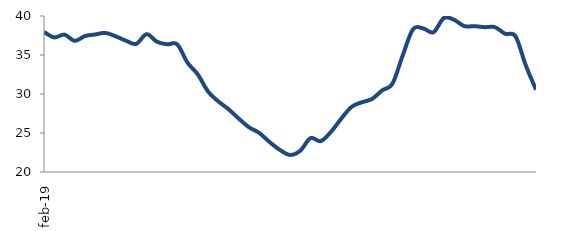
| Category | Series 0 |
|---|---|
| 2019-02-01 | 37.949 |
| 2019-03-01 | 37.255 |
| 2019-04-01 | 37.61 |
| 2019-05-01 | 36.815 |
| 2019-06-01 | 37.435 |
| 2019-07-01 | 37.632 |
| 2019-08-01 | 37.831 |
| 2019-09-01 | 37.39 |
| 2019-10-01 | 36.831 |
| 2019-11-01 | 36.425 |
| 2019-12-01 | 37.671 |
| 2020-01-01 | 36.714 |
| 2020-02-01 | 36.369 |
| 2020-03-01 | 36.361 |
| 2020-04-01 | 34.017 |
| 2020-05-01 | 32.52 |
| 2020-06-01 | 30.328 |
| 2020-07-01 | 29.058 |
| 2020-08-01 | 28.052 |
| 2020-09-01 | 26.848 |
| 2020-10-01 | 25.737 |
| 2020-11-01 | 25.008 |
| 2020-12-01 | 23.848 |
| 2021-01-01 | 22.846 |
| 2021-02-01 | 22.188 |
| 2021-03-01 | 22.726 |
| 2021-04-01 | 24.345 |
| 2021-05-01 | 23.958 |
| 2021-06-01 | 25.156 |
| 2021-07-01 | 26.838 |
| 2021-08-01 | 28.346 |
| 2021-09-01 | 28.934 |
| 2021-10-01 | 29.363 |
| 2021-11-01 | 30.47 |
| 2021-12-01 | 31.341 |
| 2022-01-01 | 34.958 |
| 2022-02-01 | 38.306 |
| 2022-03-01 | 38.403 |
| 2022-04-01 | 37.915 |
| 2022-05-01 | 39.735 |
| 2022-06-01 | 39.52 |
| 2022-07-01 | 38.706 |
| 2022-08-01 | 38.692 |
| 2022-09-01 | 38.568 |
| 2022-10-01 | 38.569 |
| 2022-11-01 | 37.717 |
| 2022-12-01 | 37.404 |
| 2023-01-01 | 33.684 |
| 2023-02-01 | 30.55 |